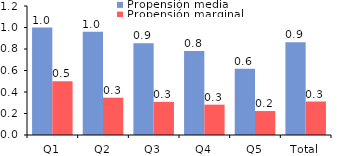
| Category | Propensión media | Propensión marginal |
|---|---|---|
| Q1 | 1 | 0.5 |
| Q2 | 0.96 | 0.347 |
| Q3 | 0.853 | 0.308 |
| Q4 | 0.781 | 0.282 |
| Q5 | 0.617 | 0.223 |
| Total | 0.863 | 0.312 |